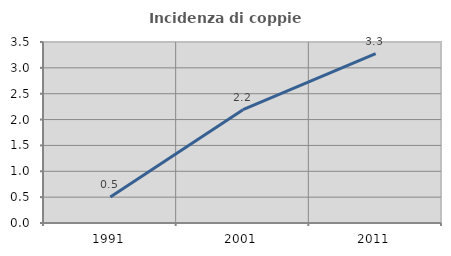
| Category | Incidenza di coppie miste |
|---|---|
| 1991.0 | 0.503 |
| 2001.0 | 2.19 |
| 2011.0 | 3.276 |